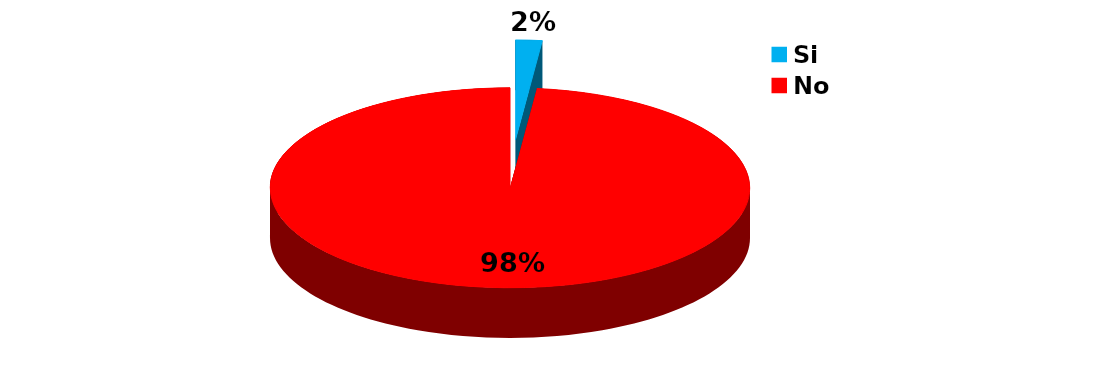
| Category | Series 0 |
|---|---|
| Si | 2 |
| No | 110 |